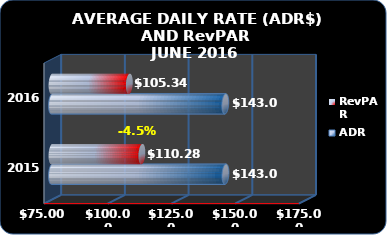
| Category | ADR | RevPAR |
|---|---|---|
| 2016.0 | 143.003 | 105.338 |
| 2015.0 | 143.079 | 110.283 |